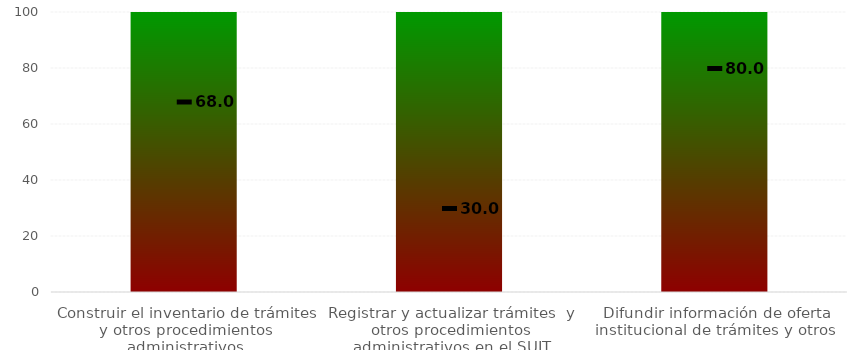
| Category | Niveles |
|---|---|
| Construir el inventario de trámites y otros procedimientos administrativos | 100 |
| Registrar y actualizar trámites  y otros procedimientos administrativos en el SUIT | 100 |
| Difundir información de oferta institucional de trámites y otros  | 100 |